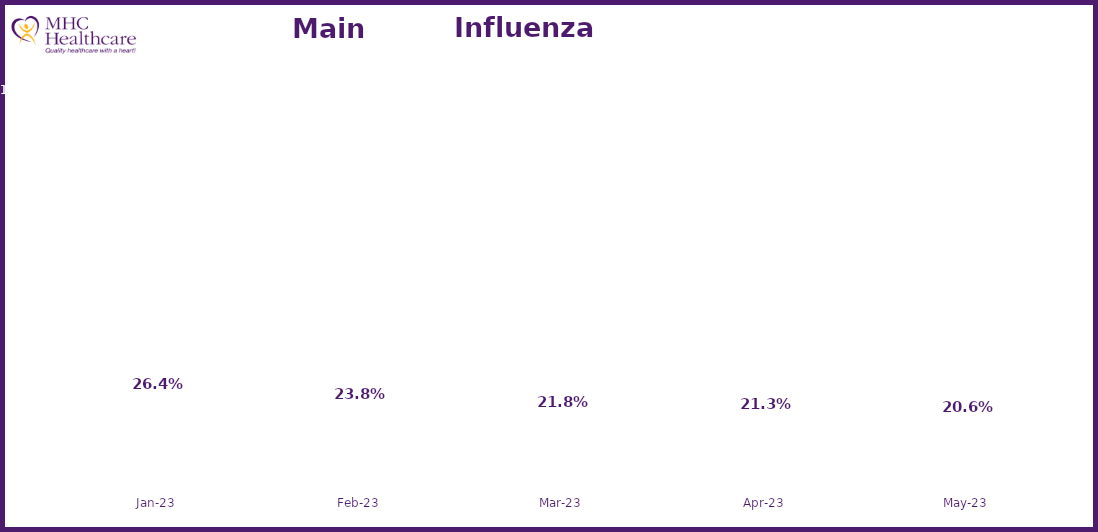
| Category | Online Access to Health Information |
|---|---|
| 2023-01-01 | 0.264 |
| 2023-02-01 | 0.238 |
| 2023-03-01 | 0.218 |
| 2023-04-01 | 0.213 |
| 2023-05-01 | 0.206 |